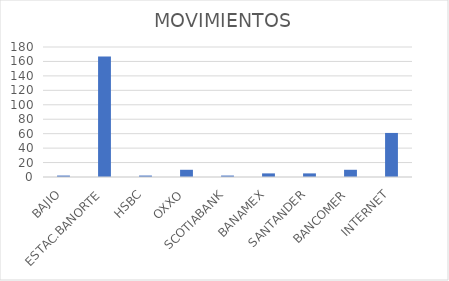
| Category | MOVIMIENTOS |
|---|---|
| BAJIO | 2 |
| ESTAC.BANORTE | 167 |
| HSBC | 2 |
| OXXO | 10 |
| SCOTIABANK | 2 |
| BANAMEX | 5 |
| SANTANDER | 5 |
| BANCOMER | 10 |
| INTERNET | 61 |